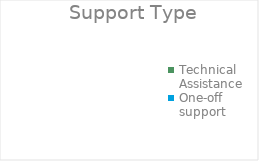
| Category | Series 0 |
|---|---|
| Technical Assistance | 0 |
| One-off support | 0 |